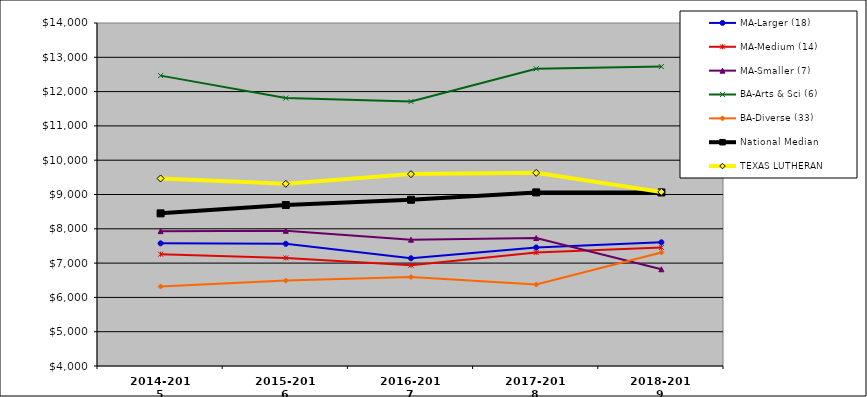
| Category | MA-Larger (18) | MA-Medium (14) | MA-Smaller (7) | BA-Arts & Sci (6) | BA-Diverse (33) | National Median | TEXAS LUTHERAN |
|---|---|---|---|---|---|---|---|
| 2014-2015 | 7575.442 | 7258.78 | 7931.595 | 12465.6 | 6318.117 | 8450.558 | 9467.017 |
| 2015-2016 | 7561.897 | 7151.283 | 7940.177 | 11810.989 | 6489.378 | 8693.909 | 9310.984 |
| 2016-2017 | 7141.15 | 6937.514 | 7683.306 | 11711.819 | 6594.03 | 8846.742 | 9594.193 |
| 2017-2018 | 7456.565 | 7307.485 | 7731.402 | 12665.477 | 6373.746 | 9061.41 | 9631.144 |
| 2018-2019 | 7606.674 | 7453.453 | 6819.564 | 12728.248 | 7310.651 | 9059.978 | 9075.626 |